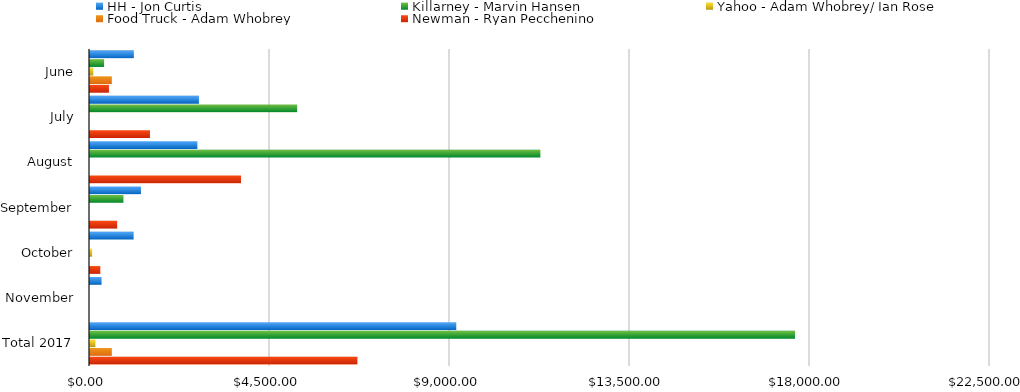
| Category | HH - Jon Curtis  | Killarney - Marvin Hansen  | Yahoo - Adam Whobrey/ Ian Rose  | Food Truck - Adam Whobrey  | Newman - Ryan Pecchenino  |
|---|---|---|---|---|---|
| June | 1096.5 | 352 | 82.5 | 545.5 | 473.5 |
| July | 2723.25 | 5178.5 | 0 | 0 | 1499.5 |
| August | 2684 | 11259.5 | 0 | 0 | 3775 |
| September | 1273.5 | 836 | 0 | 0 | 679 |
| October | 1090.5 | 0 | 52.5 | 0 | 258 |
| November | 289 | 0 | 0 | 0 | 0 |
| Total 2017 | 9156.75 | 17626 | 135 | 545.5 | 6685 |